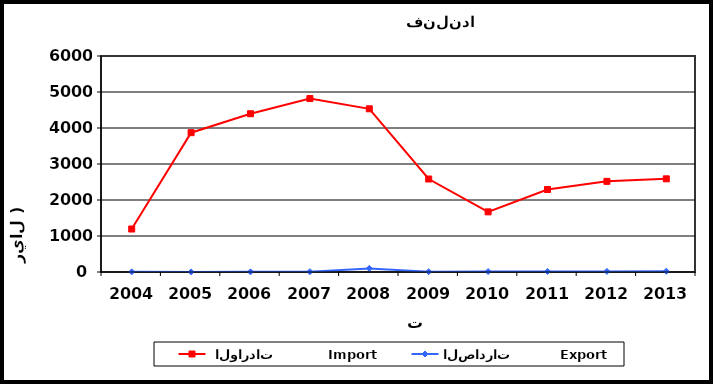
| Category |  الواردات           Import | الصادرات          Export |
|---|---|---|
| 2004.0 | 1194 | 5 |
| 2005.0 | 3870 | 3 |
| 2006.0 | 4396 | 4 |
| 2007.0 | 4818 | 9 |
| 2008.0 | 4533 | 100 |
| 2009.0 | 2583 | 8 |
| 2010.0 | 1671 | 12 |
| 2011.0 | 2291 | 15 |
| 2012.0 | 2518 | 17 |
| 2013.0 | 2588 | 22 |